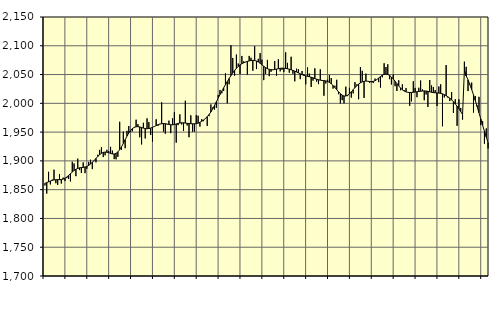
| Category | Piggar | Series 1 |
|---|---|---|
| nan | 1857.3 | 1860.96 |
| 1.0 | 1843.2 | 1862.29 |
| 1.0 | 1881 | 1863.7 |
| 1.0 | 1859.1 | 1865.03 |
| 1.0 | 1867.5 | 1866.13 |
| 1.0 | 1884.7 | 1866.98 |
| 1.0 | 1861.2 | 1867.26 |
| 1.0 | 1858.3 | 1867.4 |
| 1.0 | 1877.1 | 1867.34 |
| 1.0 | 1860.7 | 1867.57 |
| 1.0 | 1870.9 | 1868.35 |
| 1.0 | 1865 | 1869.82 |
| nan | 1870.1 | 1872.03 |
| 2.0 | 1868.7 | 1874.79 |
| 2.0 | 1864.4 | 1877.77 |
| 2.0 | 1898.5 | 1880.65 |
| 2.0 | 1895.5 | 1883.26 |
| 2.0 | 1873.5 | 1885.37 |
| 2.0 | 1903.9 | 1886.89 |
| 2.0 | 1884 | 1887.89 |
| 2.0 | 1878.9 | 1888.43 |
| 2.0 | 1897.3 | 1888.78 |
| 2.0 | 1878.7 | 1889.36 |
| 2.0 | 1886.3 | 1890.42 |
| nan | 1898.3 | 1892.15 |
| 3.0 | 1902 | 1894.54 |
| 3.0 | 1885.7 | 1897.49 |
| 3.0 | 1900.4 | 1900.83 |
| 3.0 | 1897.5 | 1904.29 |
| 3.0 | 1910.7 | 1907.7 |
| 3.0 | 1919.1 | 1910.79 |
| 3.0 | 1923.7 | 1913.23 |
| 3.0 | 1906.6 | 1914.75 |
| 3.0 | 1909.7 | 1915.34 |
| 3.0 | 1919.3 | 1915.04 |
| 3.0 | 1916.9 | 1914.11 |
| nan | 1924.4 | 1912.94 |
| 4.0 | 1917.9 | 1912.05 |
| 4.0 | 1903.1 | 1912 |
| 4.0 | 1902.7 | 1913.14 |
| 4.0 | 1907 | 1915.61 |
| 4.0 | 1968 | 1919.5 |
| 4.0 | 1919.1 | 1924.59 |
| 4.0 | 1950.9 | 1930.48 |
| 4.0 | 1922 | 1936.82 |
| 4.0 | 1952.2 | 1943.05 |
| 4.0 | 1960.6 | 1948.55 |
| 4.0 | 1950.2 | 1952.96 |
| nan | 1951.4 | 1956.22 |
| 5.0 | 1957.6 | 1958.31 |
| 5.0 | 1971.6 | 1959.31 |
| 5.0 | 1963.9 | 1959.47 |
| 5.0 | 1941 | 1959.03 |
| 5.0 | 1928.6 | 1958.08 |
| 5.0 | 1966.2 | 1957 |
| 5.0 | 1939 | 1956.19 |
| 5.0 | 1973.9 | 1955.86 |
| 5.0 | 1967.5 | 1956.17 |
| 5.0 | 1944.9 | 1957.04 |
| 5.0 | 1933.6 | 1958.33 |
| nan | 1959.5 | 1959.79 |
| 6.0 | 1972.3 | 1961.34 |
| 6.0 | 1960.9 | 1962.8 |
| 6.0 | 1964.3 | 1963.89 |
| 6.0 | 2001.7 | 1964.58 |
| 6.0 | 1950.9 | 1964.93 |
| 6.0 | 1947.2 | 1964.69 |
| 6.0 | 1963.3 | 1964.03 |
| 6.0 | 1969.9 | 1963.35 |
| 6.0 | 1948.2 | 1962.77 |
| 6.0 | 1973.9 | 1962.66 |
| 6.0 | 1985 | 1963.22 |
| nan | 1931.7 | 1964.2 |
| 7.0 | 1962.1 | 1965.14 |
| 7.0 | 1980.8 | 1965.85 |
| 7.0 | 1963.3 | 1966.19 |
| 7.0 | 1951.9 | 1966.1 |
| 7.0 | 2004.5 | 1965.67 |
| 7.0 | 1961.5 | 1965.27 |
| 7.0 | 1941.1 | 1964.96 |
| 7.0 | 1979.1 | 1964.66 |
| 7.0 | 1950.7 | 1964.42 |
| 7.0 | 1950.8 | 1964.42 |
| 7.0 | 1979.5 | 1964.75 |
| nan | 1978.5 | 1965.58 |
| 8.0 | 1959.6 | 1966.98 |
| 8.0 | 1972.5 | 1968.79 |
| 8.0 | 1969 | 1971.05 |
| 8.0 | 1974.2 | 1973.72 |
| 8.0 | 1960.7 | 1976.85 |
| 8.0 | 1977.7 | 1980.52 |
| 8.0 | 1998.1 | 1985.01 |
| 8.0 | 1992.7 | 1990.34 |
| 8.0 | 1989.2 | 1996.31 |
| 8.0 | 1992.3 | 2002.65 |
| 8.0 | 2014.6 | 2009 |
| nan | 2023.3 | 2015.2 |
| 9.0 | 2017.6 | 2021.16 |
| 9.0 | 2021.4 | 2026.9 |
| 9.0 | 2052.2 | 2032.4 |
| 9.0 | 2000 | 2037.83 |
| 9.0 | 2033.1 | 2043.13 |
| 9.0 | 2101.1 | 2048.18 |
| 9.0 | 2078.9 | 2052.91 |
| 9.0 | 2048.1 | 2057.1 |
| 9.0 | 2084.7 | 2060.83 |
| 9.0 | 2069.1 | 2064.1 |
| 9.0 | 2050.8 | 2066.76 |
| nan | 2082.3 | 2068.76 |
| 10.0 | 2073 | 2070.35 |
| 10.0 | 2072 | 2071.75 |
| 10.0 | 2049.8 | 2072.86 |
| 10.0 | 2082.4 | 2073.7 |
| 10.0 | 2079.2 | 2074.33 |
| 10.0 | 2056.6 | 2074.64 |
| 10.0 | 2099.5 | 2074.38 |
| 10.0 | 2059.5 | 2073.53 |
| 10.0 | 2077.3 | 2071.92 |
| 10.0 | 2087.1 | 2069.63 |
| 10.0 | 2075.9 | 2067.04 |
| nan | 2040.3 | 2064.45 |
| 11.0 | 2051.1 | 2062.1 |
| 11.0 | 2075.5 | 2060.23 |
| 11.0 | 2047.2 | 2059.03 |
| 11.0 | 2054.8 | 2058.43 |
| 11.0 | 2058 | 2058.32 |
| 11.0 | 2073.4 | 2058.74 |
| 11.0 | 2048 | 2059.48 |
| 11.0 | 2076.5 | 2060.2 |
| 11.0 | 2055.6 | 2060.82 |
| 11.0 | 2058.3 | 2061.09 |
| 11.0 | 2054.3 | 2060.96 |
| nan | 2088.6 | 2060.63 |
| 12.0 | 2070.3 | 2060.12 |
| 12.0 | 2053.3 | 2059.3 |
| 12.0 | 2080.9 | 2058.27 |
| 12.0 | 2051.4 | 2057.18 |
| 12.0 | 2038.2 | 2055.91 |
| 12.0 | 2060.1 | 2054.45 |
| 12.0 | 2059.3 | 2052.91 |
| 12.0 | 2042 | 2051.34 |
| 12.0 | 2056.2 | 2049.78 |
| 12.0 | 2050.6 | 2048.55 |
| 12.0 | 2033.1 | 2047.66 |
| nan | 2062.5 | 2046.99 |
| 13.0 | 2051.6 | 2046.27 |
| 13.0 | 2028.5 | 2045.34 |
| 13.0 | 2039.4 | 2044.24 |
| 13.0 | 2060.8 | 2043.06 |
| 13.0 | 2037.7 | 2041.95 |
| 13.0 | 2033.4 | 2041 |
| 13.0 | 2059.1 | 2040.25 |
| 13.0 | 2040.5 | 2039.75 |
| 13.0 | 2013.2 | 2039.45 |
| 13.0 | 2034.5 | 2038.94 |
| 13.0 | 2041.1 | 2038 |
| nan | 2049 | 2036.37 |
| 14.0 | 2044 | 2033.97 |
| 14.0 | 2025.6 | 2030.98 |
| 14.0 | 2030.6 | 2027.53 |
| 14.0 | 2040.9 | 2023.74 |
| 14.0 | 2015.9 | 2020.05 |
| 14.0 | 1999.8 | 2016.8 |
| 14.0 | 2005.5 | 2014.19 |
| 14.0 | 2000 | 2012.72 |
| 14.0 | 2029 | 2012.69 |
| 14.0 | 2012.6 | 2014.11 |
| 14.0 | 2026.9 | 2016.66 |
| nan | 2010 | 2019.96 |
| 15.0 | 2017.2 | 2023.63 |
| 15.0 | 2036.9 | 2027.3 |
| 15.0 | 2032.8 | 2030.64 |
| 15.0 | 2007.1 | 2033.4 |
| 15.0 | 2063 | 2035.58 |
| 15.0 | 2056.6 | 2037.24 |
| 15.0 | 2009.3 | 2038.29 |
| 15.0 | 2051.6 | 2038.65 |
| 15.0 | 2038.6 | 2038.41 |
| 15.0 | 2035.4 | 2037.89 |
| 15.0 | 2036.7 | 2037.67 |
| nan | 2035.2 | 2038.06 |
| 16.0 | 2043 | 2039.3 |
| 16.0 | 2041.3 | 2041.36 |
| 16.0 | 2036.8 | 2043.91 |
| 16.0 | 2027.3 | 2046.62 |
| 16.0 | 2045.2 | 2048.97 |
| 16.0 | 2069.6 | 2050.42 |
| 16.0 | 2063.1 | 2050.82 |
| 16.0 | 2067.9 | 2050.14 |
| 16.0 | 2041.9 | 2048.36 |
| 16.0 | 2032.7 | 2045.75 |
| 16.0 | 2049.9 | 2042.38 |
| nan | 2029.8 | 2038.43 |
| 17.0 | 2021.5 | 2034.26 |
| 17.0 | 2040.1 | 2030.2 |
| 17.0 | 2022.8 | 2026.54 |
| 17.0 | 2033.1 | 2023.52 |
| 17.0 | 2022.8 | 2021.32 |
| 17.0 | 2026.5 | 2019.85 |
| 17.0 | 2019.1 | 2019.09 |
| 17.0 | 1995.6 | 2018.84 |
| 17.0 | 2003.4 | 2018.92 |
| 17.0 | 2038.4 | 2019.22 |
| 17.0 | 2026.8 | 2019.61 |
| nan | 2010.7 | 2020.11 |
| 18.0 | 2027.1 | 2020.65 |
| 18.0 | 2039.7 | 2021.01 |
| 18.0 | 2024.3 | 2021.32 |
| 18.0 | 2005.4 | 2021.58 |
| 18.0 | 2015.4 | 2021.39 |
| 18.0 | 1993.7 | 2020.8 |
| 18.0 | 2040.5 | 2020.01 |
| 18.0 | 2031.1 | 2019.24 |
| 18.0 | 2028.4 | 2018.71 |
| 18.0 | 2023 | 2018.31 |
| 18.0 | 1995.5 | 2018.05 |
| nan | 2029.3 | 2017.79 |
| 19.0 | 2033 | 2017.31 |
| 19.0 | 1960.1 | 2016.44 |
| 19.0 | 2010.2 | 2015.09 |
| 19.0 | 2066.6 | 2013.31 |
| 19.0 | 2009.8 | 2011.26 |
| 19.0 | 2003.9 | 2008.9 |
| 19.0 | 2019.6 | 2006.09 |
| 19.0 | 1983.3 | 2002.79 |
| 19.0 | 2007.1 | 1999.08 |
| 19.0 | 1960.9 | 1994.99 |
| 19.0 | 2006.9 | 1990.47 |
| nan | 1991.9 | 1985.63 |
| 20.0 | 1971.7 | 1980.4 |
| 20.0 | 2072.4 | 2057.34 |
| 20.0 | 2063.4 | 2047.56 |
| 20.0 | 2021.3 | 2040.88 |
| 20.0 | 2033.9 | 2032.43 |
| 20.0 | 2036.1 | 2023.98 |
| 20.0 | 1983.9 | 2014.7 |
| 20.0 | 2012.8 | 2004.73 |
| 20.0 | 1996.7 | 1994.3 |
| 20.0 | 2011.3 | 1983.55 |
| 20.0 | 1962.1 | 1972.74 |
| nan | 1969 | 1961.93 |
| 21.0 | 1929.7 | 1951.42 |
| 21.0 | 1956.4 | 1941.42 |
| 21.0 | 1921.6 | 1932.09 |